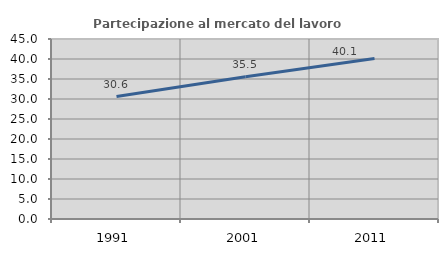
| Category | Partecipazione al mercato del lavoro  femminile |
|---|---|
| 1991.0 | 30.605 |
| 2001.0 | 35.536 |
| 2011.0 | 40.102 |